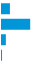
| Category | Series 0 |
|---|---|
| 0 | 0.198 |
| 1 | 0.705 |
| 2 | 0.096 |
| 3 | 0.001 |